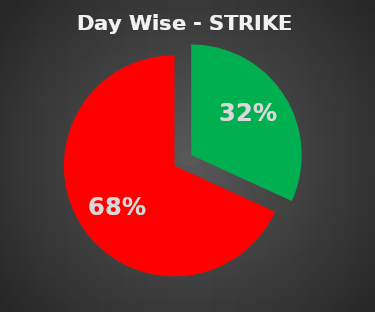
| Category | Series 0 |
|---|---|
| 0 | 0.318 |
| 1 | 0.682 |